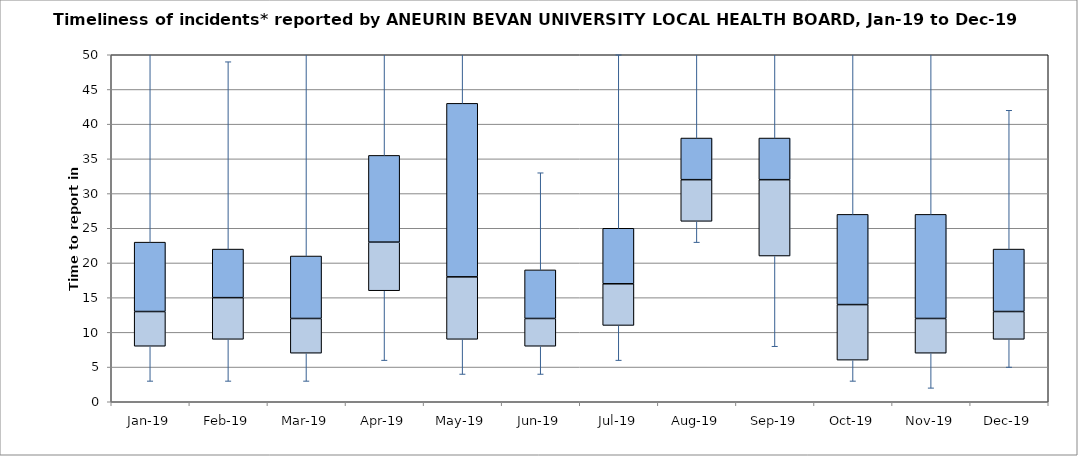
| Category | Series 0 | Series 1 | Series 2 |
|---|---|---|---|
| Jan-19 | 8 | 5 | 10 |
| Feb-19 | 9 | 6 | 7 |
| Mar-19 | 7 | 5 | 9 |
| Apr-19 | 16 | 7 | 12.5 |
| May-19 | 9 | 9 | 25 |
| Jun-19 | 8 | 4 | 7 |
| Jul-19 | 11 | 6 | 8 |
| Aug-19 | 26 | 6 | 6 |
| Sep-19 | 21 | 11 | 6 |
| Oct-19 | 6 | 8 | 13 |
| Nov-19 | 7 | 5 | 15 |
| Dec-19 | 9 | 4 | 9 |